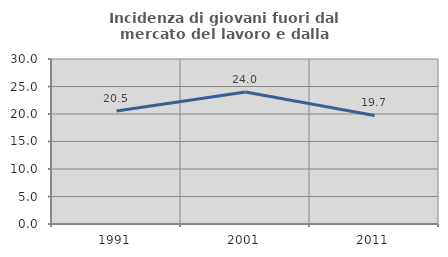
| Category | Incidenza di giovani fuori dal mercato del lavoro e dalla formazione  |
|---|---|
| 1991.0 | 20.55 |
| 2001.0 | 24.005 |
| 2011.0 | 19.737 |